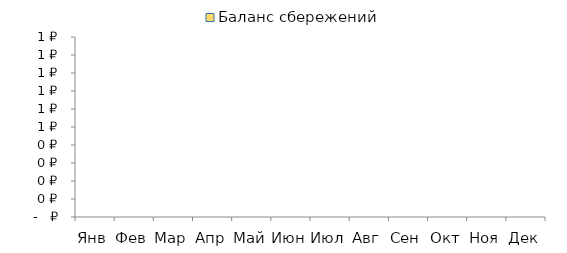
| Category | Баланс сбережений |
|---|---|
| Янв | 0 |
| Фев | 0 |
| Мар | 0 |
| Апр | 0 |
| Май | 0 |
| Июн | 0 |
| Июл | 0 |
| Авг | 0 |
| Сен | 0 |
| Окт | 0 |
| Ноя | 0 |
| Дек | 0 |